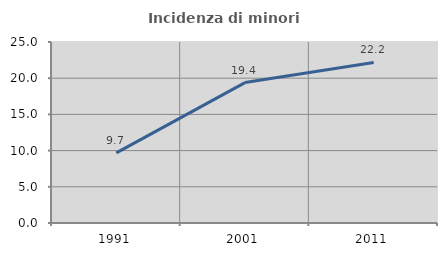
| Category | Incidenza di minori stranieri |
|---|---|
| 1991.0 | 9.682 |
| 2001.0 | 19.395 |
| 2011.0 | 22.18 |